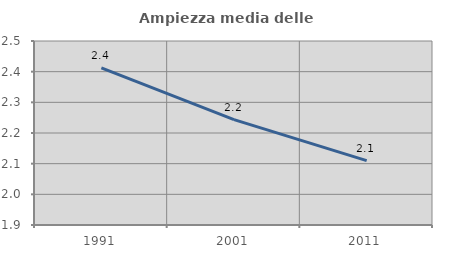
| Category | Ampiezza media delle famiglie |
|---|---|
| 1991.0 | 2.413 |
| 2001.0 | 2.243 |
| 2011.0 | 2.11 |